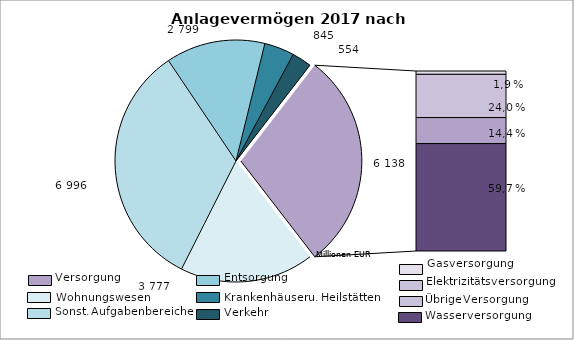
| Category | Series 0 |
|---|---|
| Wohnungsunternehmen | 3777 |
| sonstige Aufgabenbereiche | 6996 |
| Entsorgungsunternehmen | 2799 |
| Krankenhäuser | 845 |
| Verkehrsunternehmen | 554 |
| Gas | 114 |
| Elektrizität | 1474 |
| Kombinierte Unternehmen | 886 |
| Wasser | 3663 |